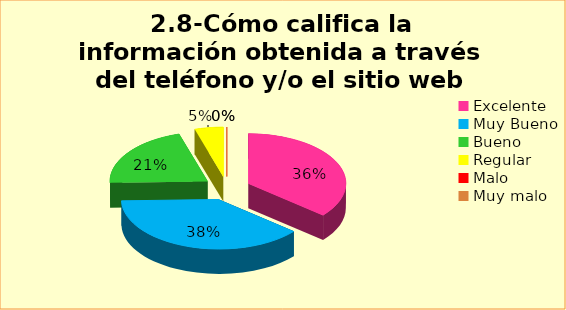
| Category | Series 0 |
|---|---|
| Excelente | 0.361 |
| Muy Bueno | 0.385 |
| Bueno  | 0.207 |
| Regular  | 0.047 |
| Malo  | 0 |
| Muy malo  | 0 |